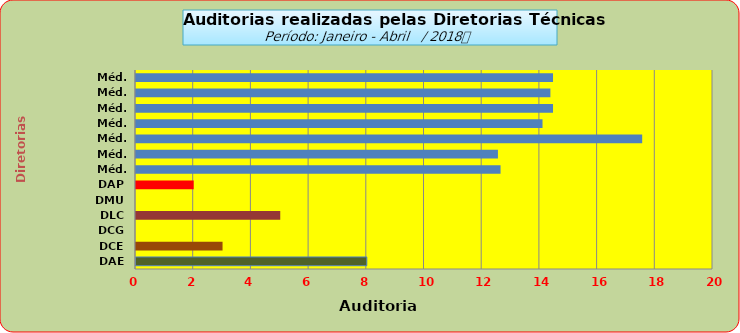
| Category | Series 0 |
|---|---|
| DAE | 8 |
| DCE | 3 |
| DCG | 0 |
| DLC | 5 |
| DMU | 0 |
| DAP | 2 |
| Méd. 2011 | 12.636 |
| Méd. 2012 | 12.545 |
| Méd. 2013 | 17.545 |
| Méd. 2014 | 14.091 |
| Méd. 2015 | 14.455 |
| Méd. 2016 | 14.364 |
| Méd. 2017 | 14.455 |